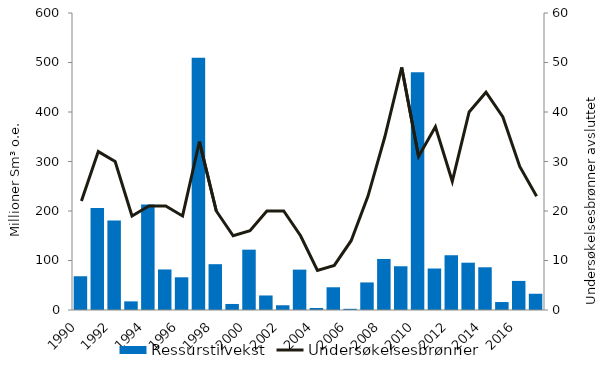
| Category | Ressurstilvekst |
|---|---|
| 1990.0 | 68.193 |
| 1991.0 | 205.969 |
| 1992.0 | 180.934 |
| 1993.0 | 17.433 |
| 1994.0 | 213.078 |
| 1995.0 | 81.89 |
| 1996.0 | 66.046 |
| 1997.0 | 509.387 |
| 1998.0 | 92.552 |
| 1999.0 | 12.186 |
| 2000.0 | 121.873 |
| 2001.0 | 29.368 |
| 2002.0 | 9.572 |
| 2003.0 | 81.565 |
| 2004.0 | 4.041 |
| 2005.0 | 45.912 |
| 2006.0 | 2.416 |
| 2007.0 | 55.693 |
| 2008.0 | 103.11 |
| 2009.0 | 88.39 |
| 2010.0 | 480.123 |
| 2011.0 | 83.799 |
| 2012.0 | 110.639 |
| 2013.0 | 95.56 |
| 2014.0 | 86.291 |
| 2015.0 | 16.076 |
| 2016.0 | 58.751 |
| 2017.0 | 32.836 |